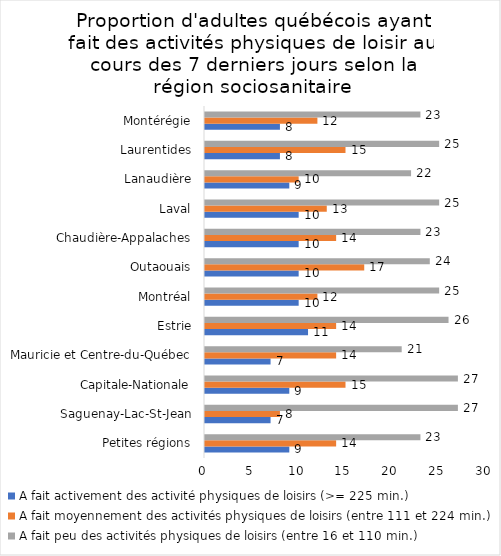
| Category | A fait activement des activité physiques de loisirs (>= 225 min.) | A fait moyennement des activités physiques de loisirs (entre 111 et 224 min.) | A fait peu des activités physiques de loisirs (entre 16 et 110 min.) |
|---|---|---|---|
| Petites régions | 9 | 14 | 23 |
| Saguenay-Lac-St-Jean | 7 | 8 | 27 |
| Capitale-Nationale | 9 | 15 | 27 |
| Mauricie et Centre-du-Québec | 7 | 14 | 21 |
| Estrie | 11 | 14 | 26 |
| Montréal | 10 | 12 | 25 |
| Outaouais | 10 | 17 | 24 |
| Chaudière-Appalaches | 10 | 14 | 23 |
| Laval | 10 | 13 | 25 |
| Lanaudière | 9 | 10 | 22 |
| Laurentides | 8 | 15 | 25 |
| Montérégie | 8 | 12 | 23 |